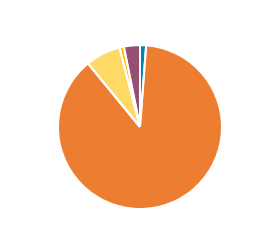
| Category | Series 0 |
|---|---|
| PC/MC | 898 |
| CAR/LGV | 66224 |
| OGV1 & PSV 2Axle | 5185 |
| OGV1 & PSV 3 Axle | 656 |
| OGV2 | 2380 |